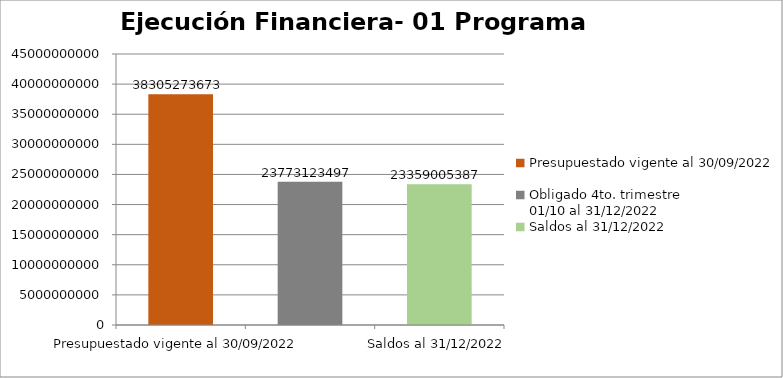
| Category | Presupuestado vigente al 30/09/2022 Obligado 4to. trimestre                      01/10 al 31/12/2022 Saldos al 31/12/2022 |
|---|---|
| Presupuestado vigente al 30/09/2022 | 38305273673 |
| Obligado 4to. trimestre                      01/10 al 31/12/2022 | 23773123497 |
| Saldos al 31/12/2022 | 23359005387 |